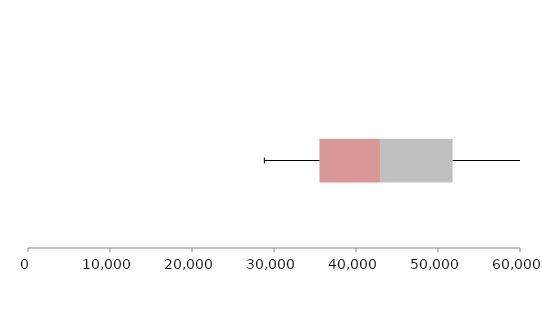
| Category | Series 1 | Series 2 | Series 3 |
|---|---|---|---|
| 0 | 35545.529 | 7376.556 | 8857.626 |